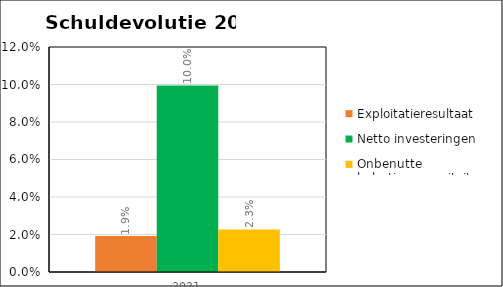
| Category | Exploitatieresultaat | Netto investeringen | Onbenutte belastingcapaciteit |
|---|---|---|---|
| 0 | 0.019 | 0.1 | 0.023 |